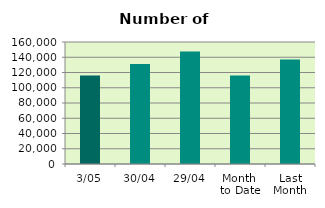
| Category | Series 0 |
|---|---|
| 3/05 | 116124 |
| 30/04 | 131296 |
| 29/04 | 147384 |
| Month 
to Date | 116124 |
| Last
Month | 137031.8 |